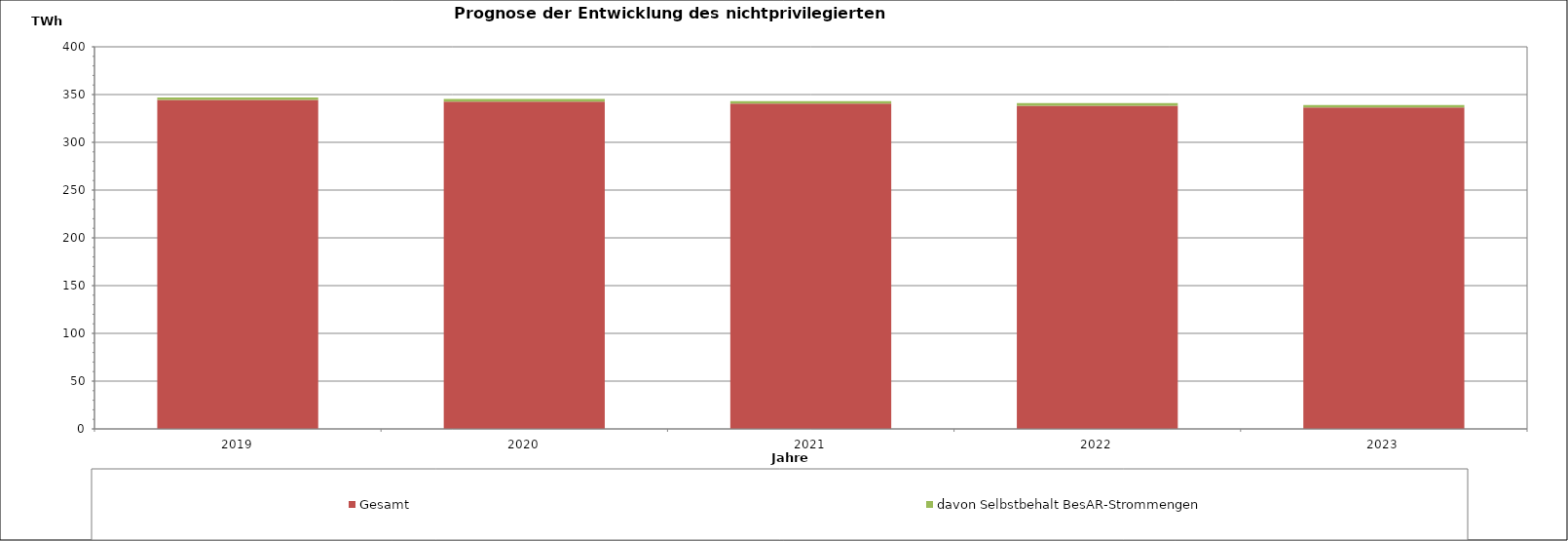
| Category |  Gesamt  |  davon Selbstbehalt BesAR-Strommengen  |
|---|---|---|
| 2019.0 | 344.354 | 2.649 |
| 2020.0 | 342.722 | 2.649 |
| 2021.0 | 340.547 | 2.649 |
| 2022.0 | 338.324 | 2.649 |
| 2023.0 | 336.438 | 2.649 |